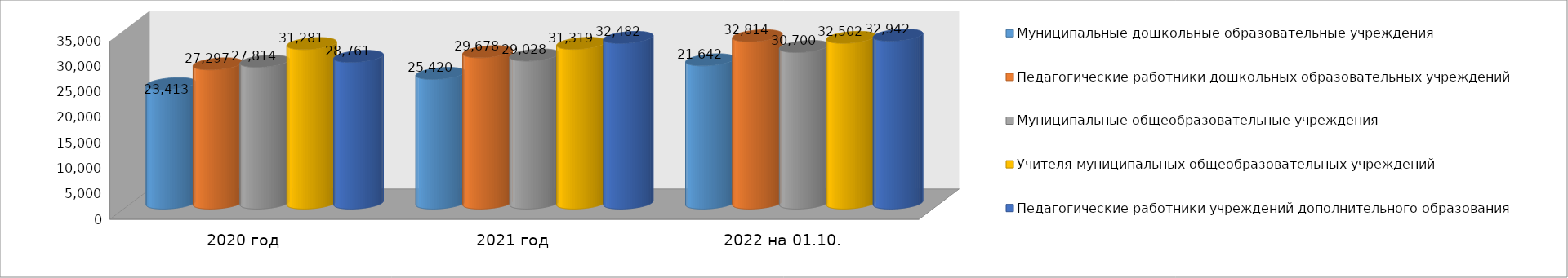
| Category | Муниципальные дошкольные образовательные учреждения | Педагогические работники дошкольных образовательных учреждений | Муниципальные общеобразовательные учреждения | Учителя муниципальных общеобразовательных учреждений | Педагогические работники учреждений дополнительного образования |
|---|---|---|---|---|---|
| 2020 год | 23413 | 27297 | 27814 | 31281 | 28761 |
| 2021 год | 25420 | 29678 | 29028 | 31319 | 32482 |
| 2022 на 01.10. | 28085 | 32814 | 30700 | 32502 | 32942 |